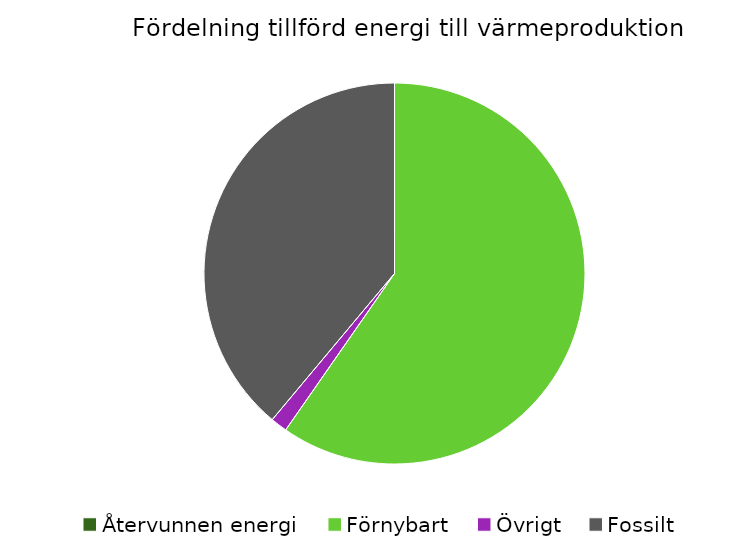
| Category | Fördelning värmeproduktion |
|---|---|
| Återvunnen energi | 0 |
| Förnybart | 0.597 |
| Övrigt | 0.014 |
| Fossilt | 0.389 |